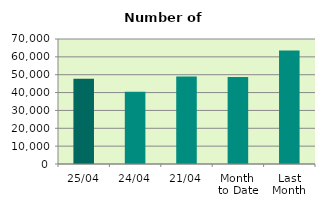
| Category | Series 0 |
|---|---|
| 25/04 | 47708 |
| 24/04 | 40508 |
| 21/04 | 49046 |
| Month 
to Date | 48771.333 |
| Last
Month | 63497.391 |